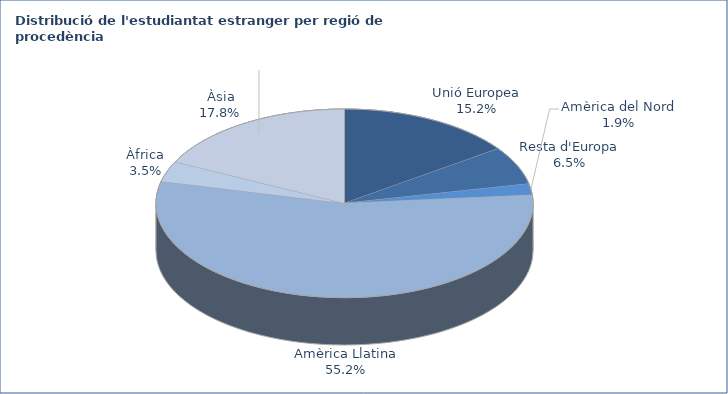
| Category | Series 0 |
|---|---|
| Unió Europea | 135 |
| Resta d'Europa | 58 |
| Amèrica del Nord | 17 |
| Amèrica Llatina | 491 |
| Àfrica | 31 |
| Àsia | 158 |